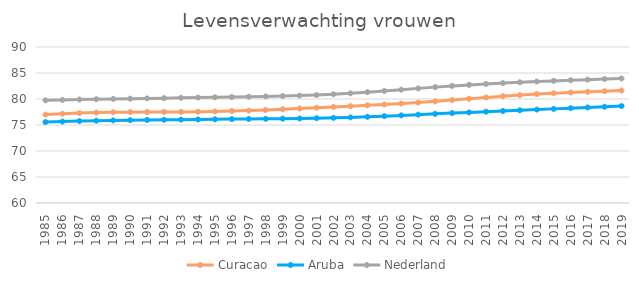
| Category | Curacao | Aruba | Nederland |
|---|---|---|---|
| 1985.0 | 76.997 | 75.556 | 79.743 |
| 1986.0 | 77.165 | 75.663 | 79.829 |
| 1987.0 | 77.294 | 75.754 | 79.9 |
| 1988.0 | 77.384 | 75.827 | 79.962 |
| 1989.0 | 77.442 | 75.886 | 80.017 |
| 1990.0 | 77.475 | 75.932 | 80.069 |
| 1991.0 | 77.491 | 75.969 | 80.119 |
| 1992.0 | 77.503 | 76.002 | 80.168 |
| 1993.0 | 77.52 | 76.033 | 80.217 |
| 1994.0 | 77.551 | 76.066 | 80.269 |
| 1995.0 | 77.602 | 76.1 | 80.323 |
| 1996.0 | 77.678 | 76.133 | 80.378 |
| 1997.0 | 77.775 | 76.164 | 80.435 |
| 1998.0 | 77.891 | 76.192 | 80.496 |
| 1999.0 | 78.023 | 76.221 | 80.566 |
| 2000.0 | 78.168 | 76.257 | 80.654 |
| 2001.0 | 78.319 | 76.307 | 80.77 |
| 2002.0 | 78.473 | 76.375 | 80.918 |
| 2003.0 | 78.627 | 76.465 | 81.099 |
| 2004.0 | 78.782 | 76.575 | 81.31 |
| 2005.0 | 78.943 | 76.703 | 81.544 |
| 2006.0 | 79.121 | 76.845 | 81.793 |
| 2007.0 | 79.322 | 76.992 | 82.043 |
| 2008.0 | 79.546 | 77.14 | 82.284 |
| 2009.0 | 79.791 | 77.285 | 82.51 |
| 2010.0 | 80.046 | 77.425 | 82.714 |
| 2011.0 | 80.299 | 77.561 | 82.897 |
| 2012.0 | 80.538 | 77.695 | 83.062 |
| 2013.0 | 80.755 | 77.83 | 83.214 |
| 2014.0 | 80.945 | 77.965 | 83.353 |
| 2015.0 | 81.109 | 78.101 | 83.484 |
| 2016.0 | 81.251 | 78.237 | 83.606 |
| 2017.0 | 81.38 | 78.372 | 83.724 |
| 2018.0 | 81.505 | 78.507 | 83.838 |
| 2019.0 | 81.63 | 78.641 | 83.952 |